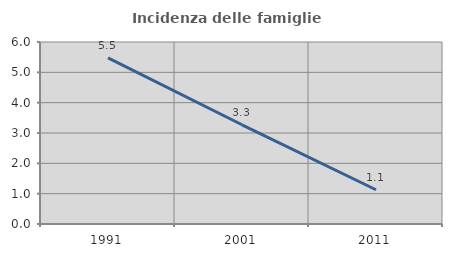
| Category | Incidenza delle famiglie numerose |
|---|---|
| 1991.0 | 5.478 |
| 2001.0 | 3.271 |
| 2011.0 | 1.128 |